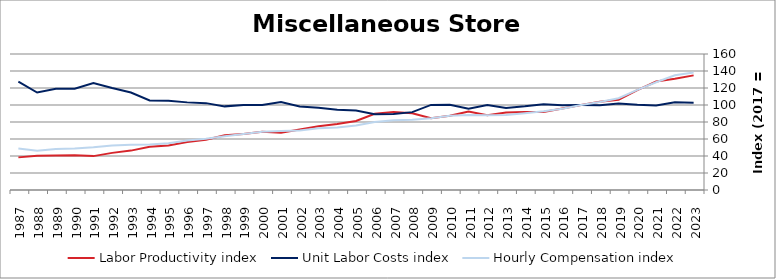
| Category | Labor Productivity index | Unit Labor Costs index | Hourly Compensation index |
|---|---|---|---|
| 2023.0 | 134.835 | 102.541 | 138.262 |
| 2022.0 | 130.908 | 103.119 | 134.991 |
| 2021.0 | 127.565 | 99.404 | 126.804 |
| 2020.0 | 117.598 | 100.174 | 117.802 |
| 2019.0 | 106.268 | 101.618 | 107.987 |
| 2018.0 | 103.8 | 99.754 | 103.544 |
| 2017.0 | 100 | 100 | 100 |
| 2016.0 | 95.846 | 99.771 | 95.627 |
| 2015.0 | 91.844 | 100.758 | 92.54 |
| 2014.0 | 91.71 | 98.413 | 90.254 |
| 2013.0 | 91.203 | 96.609 | 88.11 |
| 2012.0 | 87.998 | 99.999 | 87.997 |
| 2011.0 | 92.341 | 95.496 | 88.182 |
| 2010.0 | 87.321 | 100.149 | 87.451 |
| 2009.0 | 84.407 | 100.096 | 84.488 |
| 2008.0 | 90.249 | 91.618 | 82.684 |
| 2007.0 | 91.724 | 89.456 | 82.053 |
| 2006.0 | 89.69 | 89.236 | 80.036 |
| 2005.0 | 81.255 | 93.389 | 75.883 |
| 2004.0 | 77.715 | 94.482 | 73.427 |
| 2003.0 | 75.033 | 96.632 | 72.506 |
| 2002.0 | 71.154 | 98.298 | 69.943 |
| 2001.0 | 67.232 | 103.413 | 69.527 |
| 2000.0 | 68.474 | 100.074 | 68.524 |
| 1999.0 | 65.946 | 99.96 | 65.919 |
| 1998.0 | 64.388 | 98.388 | 63.35 |
| 1997.0 | 59.107 | 102.194 | 60.404 |
| 1996.0 | 56.514 | 103.088 | 58.26 |
| 1995.0 | 52.475 | 104.858 | 55.025 |
| 1994.0 | 50.814 | 105.426 | 53.571 |
| 1993.0 | 46.336 | 114.638 | 53.118 |
| 1992.0 | 43.672 | 119.931 | 52.377 |
| 1991.0 | 39.861 | 125.833 | 50.158 |
| 1990.0 | 40.971 | 119.224 | 48.848 |
| 1989.0 | 40.522 | 119.029 | 48.233 |
| 1988.0 | 40.314 | 114.646 | 46.218 |
| 1987.0 | 38.386 | 127.489 | 48.937 |